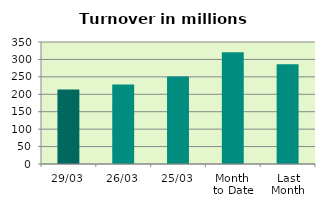
| Category | Series 0 |
|---|---|
| 29/03 | 213.573 |
| 26/03 | 228.302 |
| 25/03 | 251.298 |
| Month 
to Date | 320.588 |
| Last
Month | 285.972 |